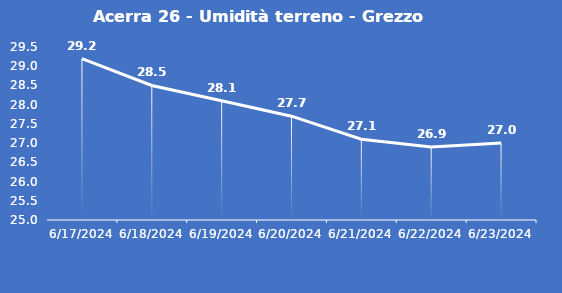
| Category | Acerra 26 - Umidità terreno - Grezzo (%VWC) |
|---|---|
| 6/17/24 | 29.2 |
| 6/18/24 | 28.5 |
| 6/19/24 | 28.1 |
| 6/20/24 | 27.7 |
| 6/21/24 | 27.1 |
| 6/22/24 | 26.9 |
| 6/23/24 | 27 |